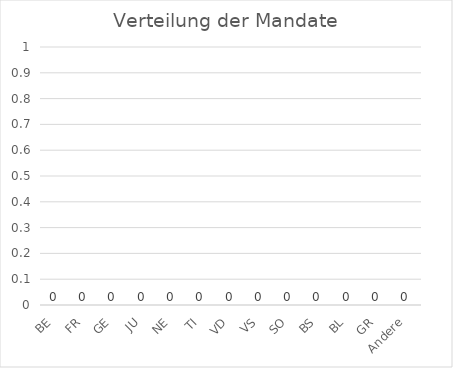
| Category | Series 0 |
|---|---|
| BE | 0 |
| FR | 0 |
| GE | 0 |
| JU | 0 |
| NE | 0 |
| TI | 0 |
| VD | 0 |
| VS | 0 |
| SO | 0 |
| BS | 0 |
| BL | 0 |
| GR | 0 |
| Andere | 0 |